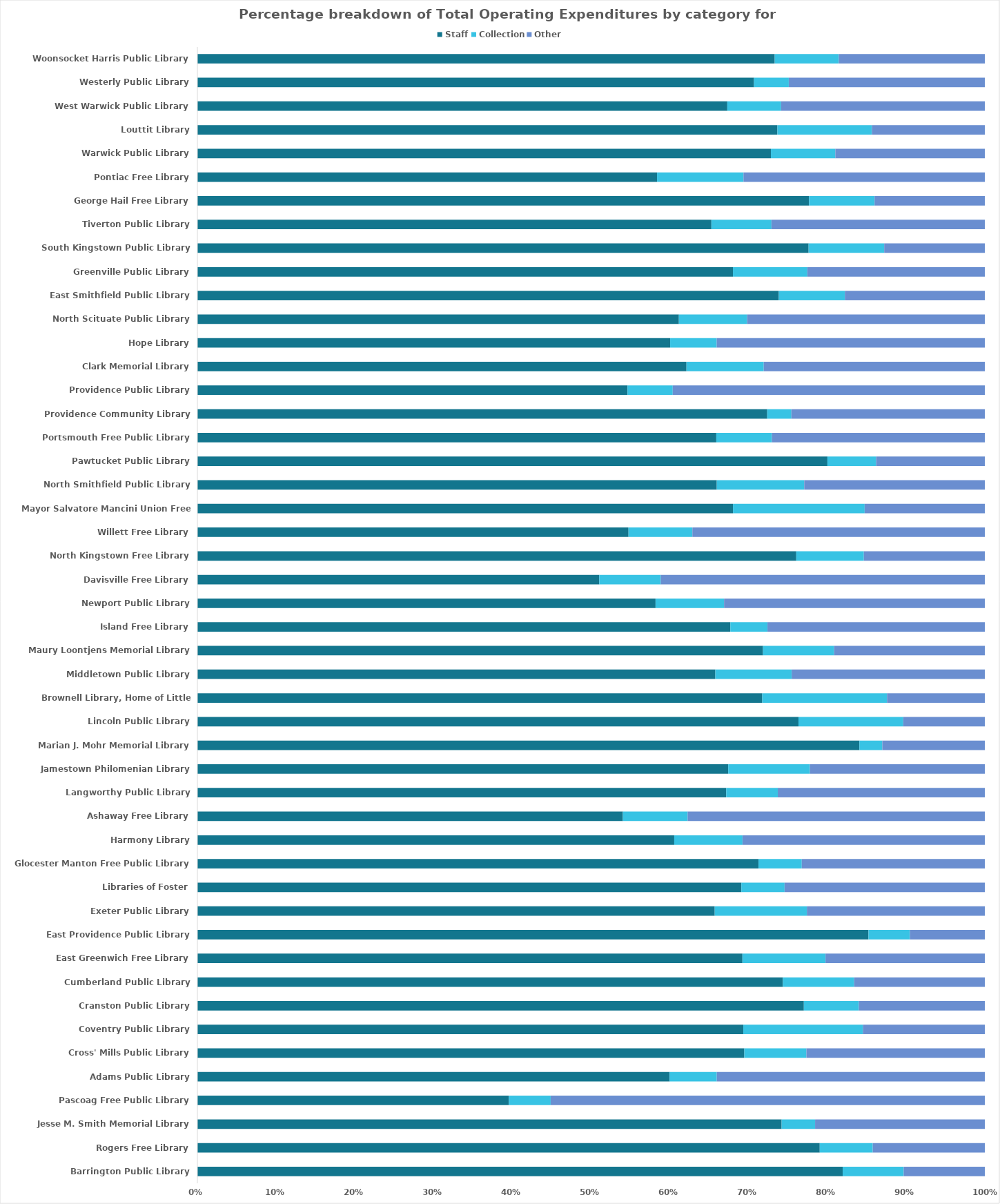
| Category | Series 0 | Staff | Collection | Other |
|---|---|---|---|---|
| Barrington Public Library |  | 0.82 | 0.077 | 0.103 |
| Rogers Free Library |  | 0.79 | 0.067 | 0.142 |
| Jesse M. Smith Memorial Library |  | 0.742 | 0.043 | 0.216 |
| Pascoag Free Public Library |  | 0.396 | 0.053 | 0.551 |
| Adams Public Library |  | 0.6 | 0.06 | 0.34 |
| Cross' Mills Public Library |  | 0.695 | 0.079 | 0.227 |
| Coventry Public Library |  | 0.693 | 0.152 | 0.155 |
| Cranston Public Library |  | 0.77 | 0.07 | 0.16 |
| Cumberland Public Library |  | 0.744 | 0.09 | 0.166 |
| East Greenwich Free Library |  | 0.692 | 0.106 | 0.202 |
| East Providence Public Library |  | 0.852 | 0.053 | 0.095 |
| Exeter Public Library |  | 0.657 | 0.117 | 0.226 |
| Libraries of Foster |  | 0.691 | 0.055 | 0.254 |
| Glocester Manton Free Public Library |  | 0.713 | 0.055 | 0.232 |
| Harmony Library |  | 0.606 | 0.087 | 0.308 |
| Ashaway Free Library |  | 0.54 | 0.082 | 0.377 |
| Langworthy Public Library |  | 0.672 | 0.066 | 0.263 |
| Jamestown Philomenian Library |  | 0.674 | 0.104 | 0.222 |
| Marian J. Mohr Memorial Library |  | 0.841 | 0.029 | 0.13 |
| Lincoln Public Library |  | 0.763 | 0.133 | 0.104 |
| Brownell Library, Home of Little Compton |  | 0.717 | 0.158 | 0.124 |
| Middletown Public Library |  | 0.658 | 0.097 | 0.245 |
| Maury Loontjens Memorial Library |  | 0.718 | 0.09 | 0.191 |
| Island Free Library |  | 0.677 | 0.047 | 0.276 |
| Newport Public Library |  | 0.582 | 0.087 | 0.331 |
| Davisville Free Library |  | 0.51 | 0.078 | 0.412 |
| North Kingstown Free Library |  | 0.761 | 0.086 | 0.154 |
| Willett Free Library |  | 0.548 | 0.081 | 0.371 |
| Mayor Salvatore Mancini Union Free Library |  | 0.68 | 0.167 | 0.153 |
| North Smithfield Public Library |  | 0.66 | 0.111 | 0.229 |
| Pawtucket Public Library |  | 0.8 | 0.062 | 0.138 |
| Portsmouth Free Public Library |  | 0.659 | 0.071 | 0.27 |
| Providence Community Library |  | 0.724 | 0.031 | 0.246 |
| Providence Public Library |  | 0.546 | 0.057 | 0.396 |
| Clark Memorial Library |  | 0.621 | 0.098 | 0.281 |
| Hope Library |  | 0.6 | 0.059 | 0.341 |
| North Scituate Public Library |  | 0.611 | 0.087 | 0.302 |
| East Smithfield Public Library |  | 0.738 | 0.084 | 0.178 |
| Greenville Public Library |  | 0.68 | 0.094 | 0.225 |
| South Kingstown Public Library |  | 0.776 | 0.096 | 0.128 |
| Tiverton Public Library |  | 0.653 | 0.076 | 0.271 |
| George Hail Free Library |  | 0.777 | 0.083 | 0.14 |
| Pontiac Free Library |  | 0.584 | 0.11 | 0.306 |
| Warwick Public Library |  | 0.728 | 0.082 | 0.19 |
| Louttit Library |  | 0.737 | 0.12 | 0.143 |
| West Warwick Public Library |  | 0.673 | 0.068 | 0.259 |
| Westerly Public Library |  | 0.707 | 0.044 | 0.249 |
| Woonsocket Harris Public Library |  | 0.733 | 0.081 | 0.185 |